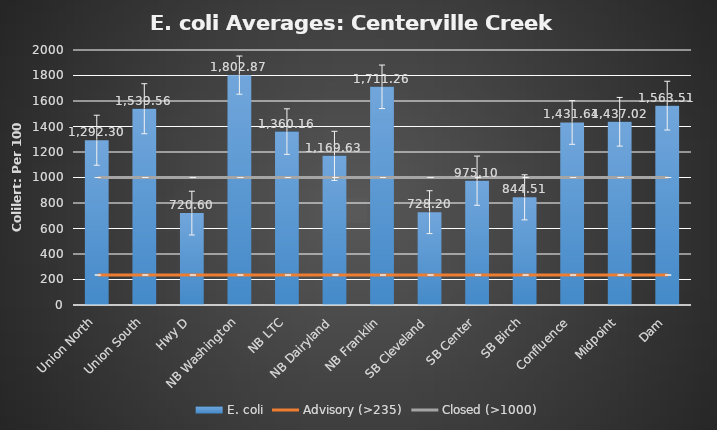
| Category | E. coli |
|---|---|
| Union North | 1292.305 |
| Union South | 1539.557 |
| Hwy D | 720.595 |
| NB Washington | 1802.871 |
| NB LTC | 1360.157 |
| NB Dairyland | 1169.633 |
| NB Franklin | 1711.257 |
| SB Cleveland | 728.195 |
| SB Center | 975.095 |
| SB Birch | 844.514 |
| Confluence | 1431.638 |
| Midpoint | 1437.024 |
| Dam | 1563.51 |